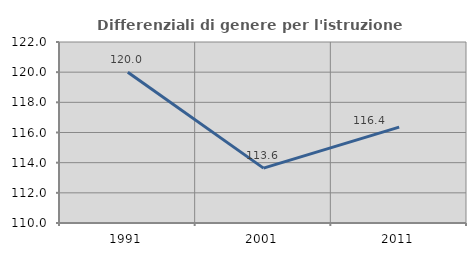
| Category | Differenziali di genere per l'istruzione superiore |
|---|---|
| 1991.0 | 120 |
| 2001.0 | 113.639 |
| 2011.0 | 116.353 |